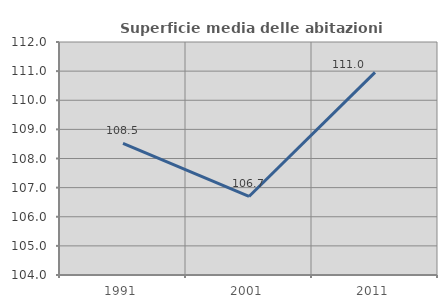
| Category | Superficie media delle abitazioni occupate |
|---|---|
| 1991.0 | 108.521 |
| 2001.0 | 106.697 |
| 2011.0 | 110.959 |